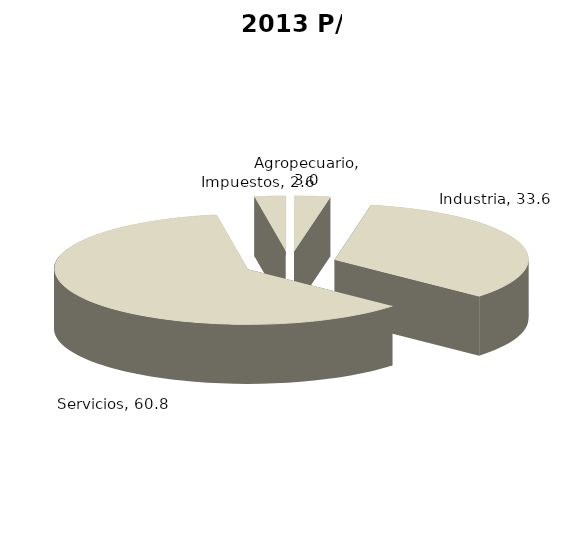
| Category | 2013 P/ |
|---|---|
| Agropecuario | 2.991 |
| Industria | 33.618 |
| Servicios | 60.808 |
| Impuestos | 2.583 |